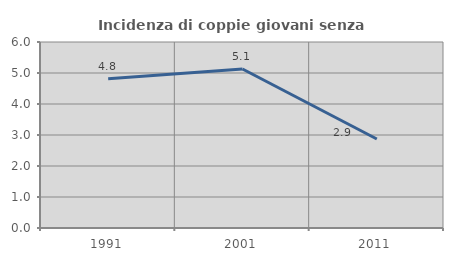
| Category | Incidenza di coppie giovani senza figli |
|---|---|
| 1991.0 | 4.813 |
| 2001.0 | 5.128 |
| 2011.0 | 2.871 |